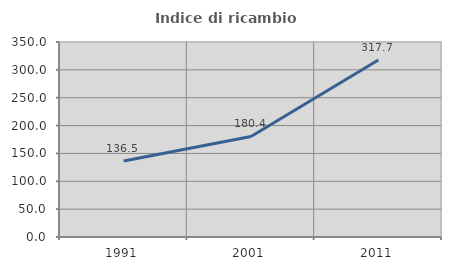
| Category | Indice di ricambio occupazionale  |
|---|---|
| 1991.0 | 136.522 |
| 2001.0 | 180.412 |
| 2011.0 | 317.742 |